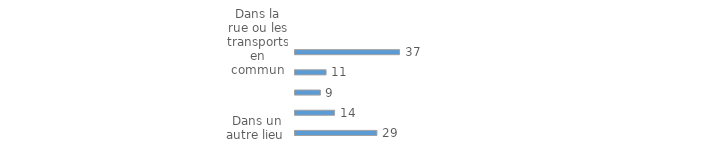
| Category | Series 0 | Series 1 | Series 2 |
|---|---|---|---|
| Dans la rue ou les transports en commun |  |  | 37 |
| Sur le lieu de travail ou d'études  |  |  | 11 |
| Au domicile ou dans l'immeuble de la victime |  |  | 9 |
| Au domicile d'une autre personne |  |  | 14 |
| Dans un autre lieu  |  |  | 29 |